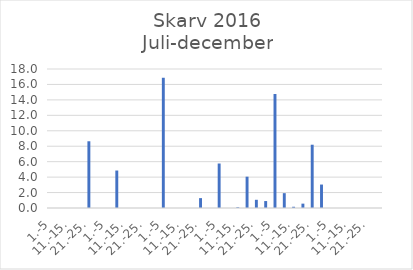
| Category | Series 0 |
|---|---|
| 1.-5 | 0 |
| 6.-10. | 0 |
| 11.-15. | 0 |
| 16.-20. | 0 |
| 21.-25. | 8.641 |
| 26.-31. | 0 |
| 1.-5 | 0 |
| 6.-10. | 4.853 |
| 11.-15. | 0 |
| 16.-20. | 0 |
| 21.-25. | 0 |
| 26.-31. | 0 |
| 1.-5 | 16.866 |
| 6.-10. | 0 |
| 11.-15. | 0 |
| 16.-20. | 0 |
| 21.-25. | 1.279 |
| 26.-30. | 0 |
| 1.-5 | 5.762 |
| 6.-10. | 0 |
| 11.-15. | 0.094 |
| 16.-20. | 4.056 |
| 21.-25. | 1.062 |
| 26.-31. | 0.899 |
| 1.-5 | 14.766 |
| 6.-10. | 1.921 |
| 11.-15. | 0.16 |
| 16.-20. | 0.566 |
| 21.-25. | 8.195 |
| 26.-30. | 3.037 |
| 1.-5 | 0 |
| 6.-10. | 0 |
| 11.-15. | 0 |
| 16.-20. | 0 |
| 21.-25. | 0 |
| 26.-31. | 0 |